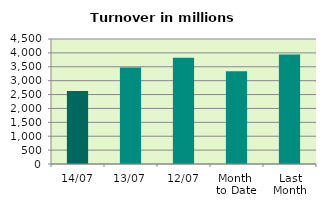
| Category | Series 0 |
|---|---|
| 14/07 | 2630.065 |
| 13/07 | 3476.082 |
| 12/07 | 3821.719 |
| Month 
to Date | 3339.568 |
| Last
Month | 3940.311 |